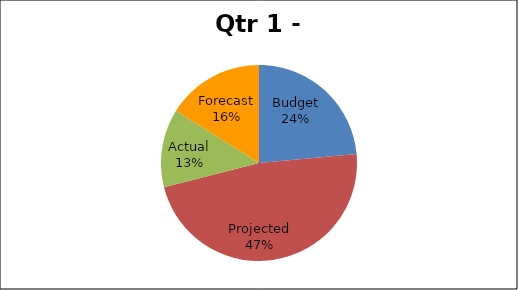
| Category | Series 0 |
|---|---|
| Budget | 1040 |
| Projected | 2100 |
| Actual | 570 |
| Forecast | 710 |